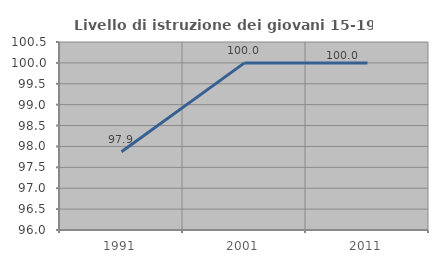
| Category | Livello di istruzione dei giovani 15-19 anni |
|---|---|
| 1991.0 | 97.872 |
| 2001.0 | 100 |
| 2011.0 | 100 |